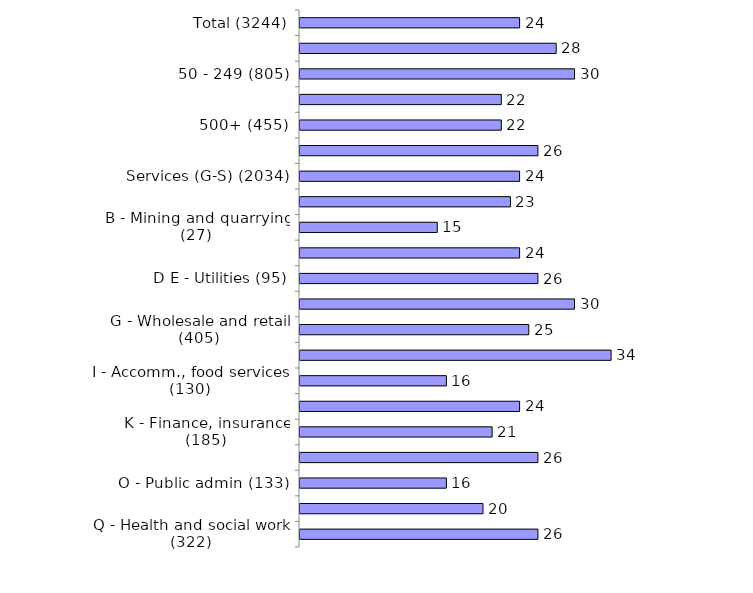
| Category | Series 0 |
|---|---|
| Total (3244) | 24 |
| 10-49 (1658) | 28 |
| 50 - 249 (805) | 30 |
| 250 - 499 (326) | 22 |
| 500+ (455) | 22 |
| Production (A-F) (1210) | 26 |
| Services (G-S) (2034) | 24 |
| A - Agriculture (96) | 23 |
| B - Mining and quarrying (27) | 15 |
| C - Manufacturing (866) | 24 |
| D E - Utilities (95) | 26 |
| F - Construction (126) | 30 |
| G - Wholesale and retail (405) | 25 |
| H - Transport, storage (148) | 34 |
| I - Accomm., food services (130) | 16 |
| J - Information, comms (110) | 24 |
| K - Finance, insurance (185) | 21 |
| LMNRS - Bus/tech/admin/arts/other (272) | 26 |
| O - Public admin (133) | 16 |
| P - Education (329) | 20 |
| Q - Health and social work (322) | 26 |